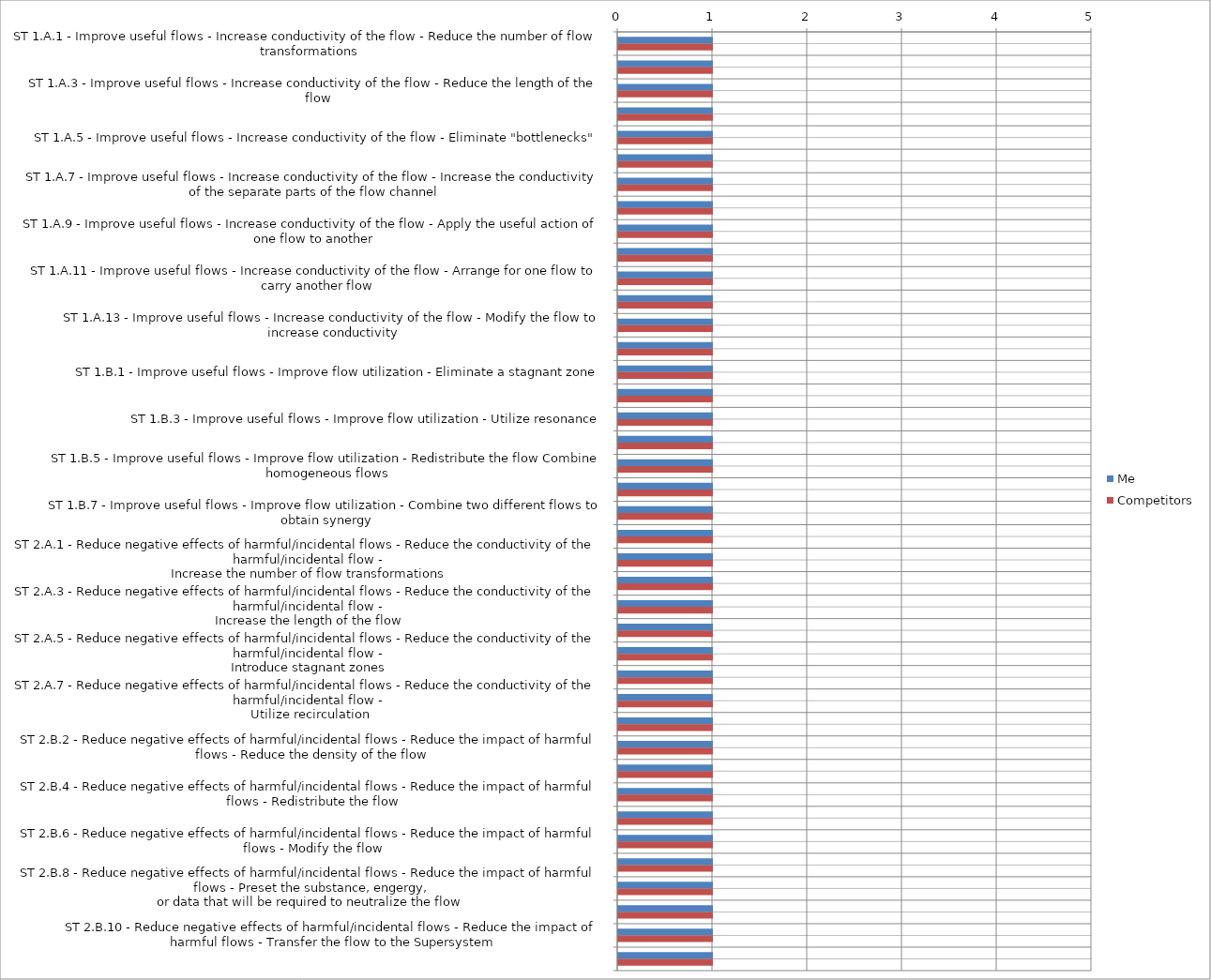
| Category | Me | Competitors |
|---|---|---|
| ST 1.A.1 - Improve useful flows - Increase conductivity of the flow - Reduce the number of flow transformations | 1 | 1 |
| ST 1.A.2 - Improve useful flows - Increase conductivity of the flow - Transition to a more efficient flow type | 1 | 1 |
| ST 1.A.3 - Improve useful flows - Increase conductivity of the flow - Reduce the length of the flow | 1 | 1 |
| ST 1.A.4 - Improve useful flows - Increase conductivity of the flow - Eliminate "grazy zones" | 1 | 1 |
| ST 1.A.5 - Improve useful flows - Increase conductivity of the flow - Eliminate "bottlenecks" | 1 | 1 |
| ST 1.A.6 - Improve useful flows - Increase conductivity of the flow - Create a bypass | 1 | 1 |
| ST 1.A.7 - Improve useful flows - Increase conductivity of the flow - Increase the conductivity of the separate parts of the flow channel | 1 | 1 |
| ST 1.A.8 - Improve useful flows - Increase conductivity of the flow - Increase the density of the flow | 1 | 1 |
| ST 1.A.9 - Improve useful flows - Increase conductivity of the flow - Apply the useful action of one flow to another | 1 | 1 |
| ST 1.A.10 - Improve useful flows - Increase conductivity of the flow - Apply the useful action of one flow to the channel of another flow | 1 | 1 |
| ST 1.A.11 - Improve useful flows - Increase conductivity of the flow - Arrange for one flow to carry another flow | 1 | 1 |
| ST 1.A.12 - Improve useful flows - Increase conductivity of the flow - Allot many flows to one channel | 1 | 1 |
| ST 1.A.13 - Improve useful flows - Increase conductivity of the flow - Modify the flow to increase conductivity | 1 | 1 |
| ST 1.A.14 - Improve useful flows - Increase conductivity of the flow - Direct the flow through a Supersystem channel | 1 | 1 |
| ST 1.B.1 - Improve useful flows - Improve flow utilization - Eliminate a stagnant zone | 1 | 1 |
| ST 1.B.2 - Improve useful flows - Improve flow utilization - Utilize impulse action | 1 | 1 |
| ST 1.B.3 - Improve useful flows - Improve flow utilization - Utilize resonance | 1 | 1 |
| ST 1.B.4 - Improve useful flows - Improve flow utilization - Modulate the flow | 1 | 1 |
| ST 1.B.5 - Improve useful flows - Improve flow utilization - Redistribute the flow Combine homogeneous flows | 1 | 1 |
| ST 1.B.6 - Improve useful flows - Improve flow utilization - Utilize recirculation | 1 | 1 |
| ST 1.B.7 - Improve useful flows - Improve flow utilization - Combine two different flows to obtain synergy | 1 | 1 |
| ST 1.B.8 - Improve useful flows - Improve flow utilization - Preset the necessary substance, energy, or information | 1 | 1 |
| ST 2.A.1 - Reduce negative effects of harmful/incidental flows - Reduce the conductivity of the harmful/incidental flow - _x000d_Increase the number of flow transformations | 1 | 1 |
| ST 2.A.2 - Reduce negative effects of harmful/incidental flows - Reduce the conductivity of the harmful/incidental flow - _x000d_Transition to a low-conductivity flow | 1 | 1 |
| ST 2.A.3 - Reduce negative effects of harmful/incidental flows - Reduce the conductivity of the harmful/incidental flow - _x000d_Increase the length of the flow | 1 | 1 |
| ST 2.A.4 - Reduce negative effects of harmful/incidental flows - Reduce the conductivity of the harmful/incidental flow - _x000d_Introduce bottlenecks | 1 | 1 |
| ST 2.A.5 - Reduce negative effects of harmful/incidental flows - Reduce the conductivity of the harmful/incidental flow - _x000d_Introduce stagnant zones | 1 | 1 |
| ST 2.A.6 - Reduce negative effects of harmful/incidental flows - Reduce the conductivity of the harmful/incidental flow - _x000d_Reduce the conductivity of part of the flow channel | 1 | 1 |
| ST 2.A.7 - Reduce negative effects of harmful/incidental flows - Reduce the conductivity of the harmful/incidental flow - _x000d_Utilize recirculation | 1 | 1 |
| ST 2.B.1 - Reduce negative effects of harmful/incidental flows - Reduce the impact of harmful flows - Introduce gray zones | 1 | 1 |
| ST 2.B.2 - Reduce negative effects of harmful/incidental flows - Reduce the impact of harmful flows - Reduce the density of the flow | 1 | 1 |
| ST 2.B.3 - Reduce negative effects of harmful/incidental flows - Reduce the impact of harmful flows - Eliminate resonance | 1 | 1 |
| ST 2.B.4 - Reduce negative effects of harmful/incidental flows - Reduce the impact of harmful flows - Redistribute the flow | 1 | 1 |
| ST 2.B.5 - Reduce negative effects of harmful/incidental flows - Reduce the impact of harmful flows - Combine a flow and an anti-flow | 1 | 1 |
| ST 2.B.6 - Reduce negative effects of harmful/incidental flows - Reduce the impact of harmful flows - Modify the flow | 1 | 1 |
| ST 2.B.7 - Reduce negative effects of harmful/incidental flows - Reduce the impact of harmful flows - Modify the damaged objects | 1 | 1 |
| ST 2.B.8 - Reduce negative effects of harmful/incidental flows - Reduce the impact of harmful flows - Preset the substance, engergy,_x000d_or data that will be required to neutralize the flow | 1 | 1 |
| ST 2.B.9 - Reduce negative effects of harmful/incidental flows - Reduce the impact of harmful flows - Bypass | 1 | 1 |
| ST 2.B.10 - Reduce negative effects of harmful/incidental flows - Reduce the impact of harmful flows - Transfer the flow to the Supersystem | 1 | 1 |
| ST 2.B.11 - Reduce negative effects of harmful/incidental flows - Reduce the impact of harmful flows - Recycle or recover incidental flows | 1 | 1 |